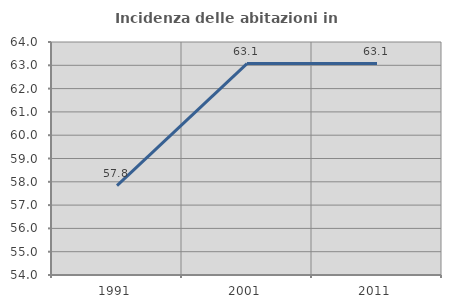
| Category | Incidenza delle abitazioni in proprietà  |
|---|---|
| 1991.0 | 57.838 |
| 2001.0 | 63.074 |
| 2011.0 | 63.073 |